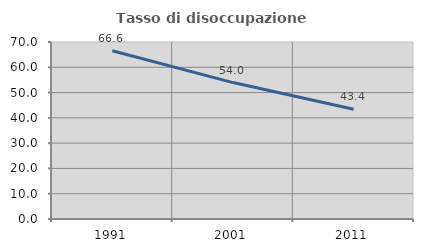
| Category | Tasso di disoccupazione giovanile  |
|---|---|
| 1991.0 | 66.56 |
| 2001.0 | 53.95 |
| 2011.0 | 43.369 |